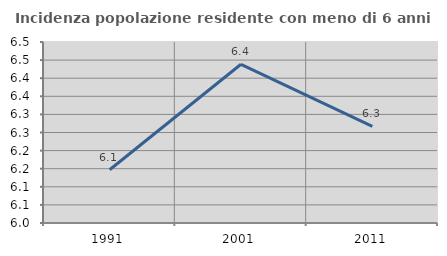
| Category | Incidenza popolazione residente con meno di 6 anni |
|---|---|
| 1991.0 | 6.147 |
| 2001.0 | 6.438 |
| 2011.0 | 6.267 |